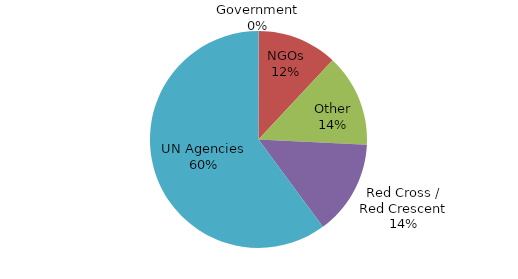
| Category | Series 0 |
|---|---|
| Government | 91592 |
| NGOs | 30444938 |
| Other | 35304040 |
| Red Cross / Red Crescent | 36138562 |
| UN Agencies | 153629999 |